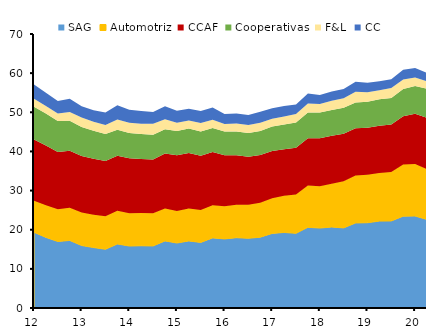
| Category | SAG | Automotriz | CCAF | Cooperativas | F&L | CC |
|---|---|---|---|---|---|---|
| 12 | 19.345 | 8.086 | 15.628 | 8.372 | 2.043 | 3.628 |
| II | 18.042 | 8.225 | 15.222 | 8.172 | 1.939 | 3.412 |
| III | 16.986 | 8.271 | 14.59 | 7.922 | 1.928 | 3.161 |
| IV | 17.259 | 8.347 | 14.568 | 7.645 | 2.248 | 3.4 |
| 13 | 15.957 | 8.427 | 14.464 | 7.386 | 2.412 | 2.889 |
| II | 15.443 | 8.37 | 14.298 | 7.17 | 2.324 | 2.921 |
| III | 15.001 | 8.449 | 14.098 | 6.873 | 2.352 | 3.175 |
| IV | 16.353 | 8.465 | 14.048 | 6.674 | 2.624 | 3.664 |
| 14 | 15.828 | 8.386 | 14.067 | 6.452 | 2.585 | 3.347 |
| II | 15.901 | 8.371 | 13.802 | 6.35 | 2.663 | 3.224 |
| III | 15.847 | 8.355 | 13.762 | 6.302 | 2.795 | 3.033 |
| IV | 17.142 | 8.264 | 14.065 | 6.225 | 2.552 | 3.279 |
| 15 | 16.6 | 8.188 | 14.217 | 6.203 | 2.092 | 3.112 |
| II | 17.13 | 8.274 | 14.19 | 6.259 | 2.023 | 3.008 |
| III | 16.749 | 8.304 | 13.865 | 6.188 | 2.143 | 3.055 |
| IV | 17.912 | 8.35 | 13.613 | 6.12 | 2.078 | 3.139 |
| 16 | 17.649 | 8.332 | 13.043 | 6.058 | 1.894 | 2.602 |
| II | 17.963 | 8.427 | 12.612 | 6.061 | 2.085 | 2.569 |
| III | 17.805 | 8.574 | 12.256 | 6.094 | 2.027 | 2.525 |
| IV | 18.09 | 8.778 | 12.192 | 6.156 | 2.14 | 2.8 |
| 17 | 19.051 | 8.999 | 12.066 | 6.254 | 1.97 | 2.679 |
| II | 19.304 | 9.342 | 11.891 | 6.365 | 2.029 | 2.703 |
| III | 19.07 | 9.918 | 11.929 | 6.501 | 2.164 | 2.436 |
| IV | 20.61 | 10.656 | 12.117 | 6.548 | 2.289 | 2.608 |
| 18 | 20.424 | 10.665 | 12.287 | 6.54 | 2.227 | 2.259 |
| II | 20.685 | 11.039 | 12.257 | 6.633 | 2.358 | 2.338 |
| III | 20.461 | 11.899 | 12.179 | 6.647 | 2.414 | 2.334 |
| IV | 21.72 | 12.112 | 12.059 | 6.606 | 2.768 | 2.564 |
| 19 | 21.785 | 12.235 | 12.01 | 6.644 | 2.427 | 2.438 |
| II | 22.201 | 12.313 | 12.079 | 6.722 | 2.316 | 2.271 |
| III | 22.232 | 12.5 | 12.172 | 6.77 | 2.504 | 2.235 |
| IV | 23.459 | 13.179 | 12.373 | 6.919 | 2.472 | 2.481 |
| 20 | 23.499 | 13.258 | 12.855 | 7.072 | 2.217 | 2.407 |
| II | 22.603 | 12.842 | 13.151 | 7.445 | 1.856 | 2.193 |